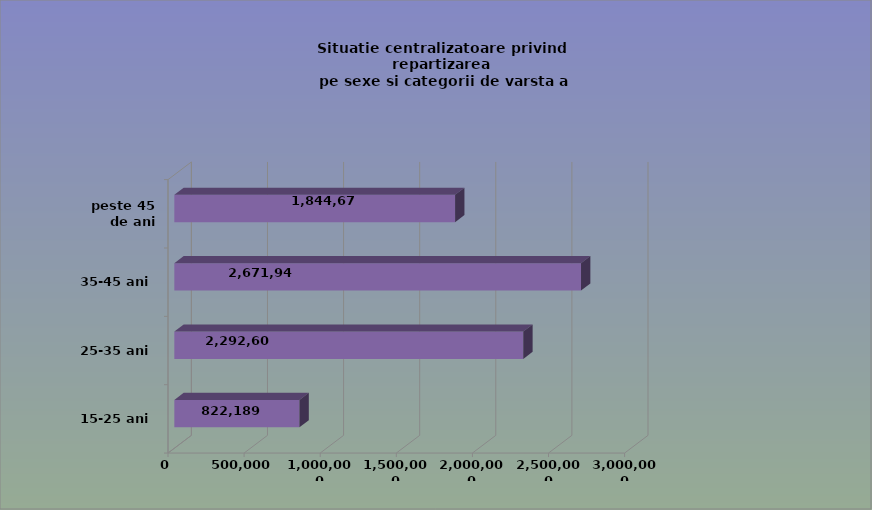
| Category | 15-25 ani 25-35 ani 35-45 ani peste 45 de ani |
|---|---|
| 15-25 ani | 822189 |
| 25-35 ani | 2292603 |
| 35-45 ani | 2671942 |
| peste 45 de ani | 1844678 |